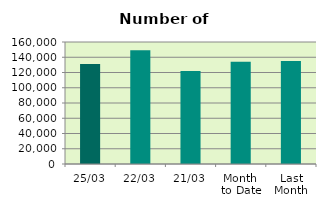
| Category | Series 0 |
|---|---|
| 25/03 | 130992 |
| 22/03 | 149072 |
| 21/03 | 122008 |
| Month 
to Date | 134026.588 |
| Last
Month | 135041.7 |